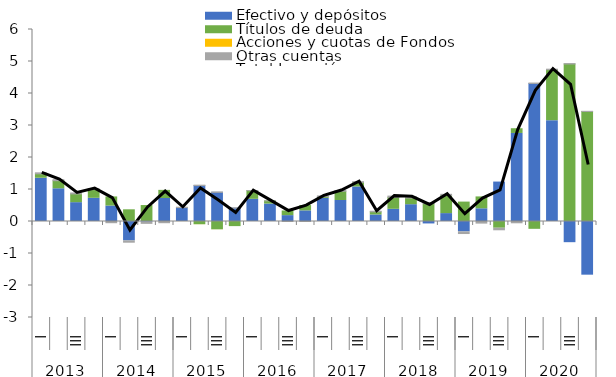
| Category | Efectivo y depósitos | Títulos de deuda | Acciones y cuotas de Fondos | Otras cuentas |
|---|---|---|---|---|
| 0 | 1.352 | 0.137 | 0 | 0.032 |
| 1 | 1.023 | 0.252 | 0.001 | 0.032 |
| 2 | 0.589 | 0.271 | 0.001 | 0.03 |
| 3 | 0.725 | 0.271 | 0.001 | 0.03 |
| 4 | 0.483 | 0.285 | 0.001 | -0.038 |
| 5 | -0.605 | 0.365 | 0.001 | -0.042 |
| 6 | -0.019 | 0.499 | 0 | -0.039 |
| 7 | 0.718 | 0.255 | -0.001 | -0.037 |
| 8 | 0.419 | 0.016 | -0.002 | 0.012 |
| 9 | 1.122 | -0.101 | -0.002 | 0.013 |
| 10 | 0.911 | -0.26 | -0.002 | 0.012 |
| 11 | 0.416 | -0.16 | -0.001 | 0.011 |
| 12 | 0.693 | 0.272 | 0 | 0.001 |
| 13 | 0.546 | 0.099 | 0 | 0 |
| 14 | 0.184 | 0.145 | 0 | -0.001 |
| 15 | 0.332 | 0.166 | 0 | 0 |
| 16 | 0.722 | 0.055 | 0 | 0.022 |
| 17 | 0.656 | 0.289 | 0 | 0.022 |
| 18 | 1.079 | 0.143 | 0 | 0.023 |
| 19 | 0.204 | 0.098 | 0 | 0.018 |
| 20 | 0.381 | 0.374 | 0 | 0.038 |
| 21 | 0.525 | 0.21 | 0 | 0.037 |
| 22 | -0.076 | 0.557 | 0 | 0.036 |
| 23 | 0.247 | 0.568 | 0 | 0.035 |
| 24 | -0.324 | 0.607 | 0 | -0.052 |
| 25 | 0.397 | 0.371 | 0 | -0.05 |
| 26 | 1.232 | -0.21 | 0 | -0.049 |
| 27 | 2.751 | 0.148 | 0 | -0.04 |
| 28 | 4.314 | -0.244 | 0 | 0.013 |
| 29 | 3.151 | 1.594 | 0 | 0.015 |
| 30 | -0.662 | 4.922 | 0 | 0.013 |
| 31 | -1.677 | 3.437 | 0 | 0.006 |